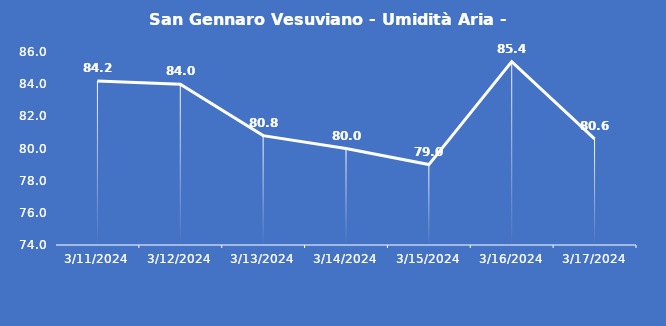
| Category | San Gennaro Vesuviano - Umidità Aria - Grezzo (%) |
|---|---|
| 3/11/24 | 84.2 |
| 3/12/24 | 84 |
| 3/13/24 | 80.8 |
| 3/14/24 | 80 |
| 3/15/24 | 79 |
| 3/16/24 | 85.4 |
| 3/17/24 | 80.6 |